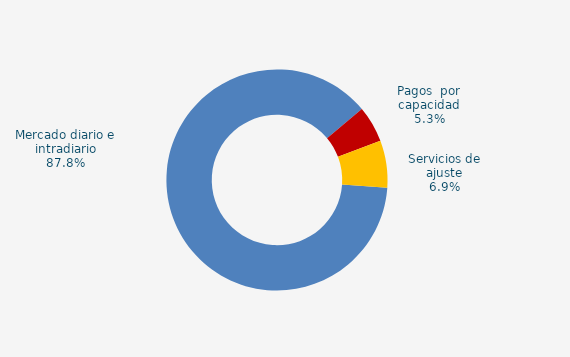
| Category | Series 0 |
|---|---|
| Mercado diario e intradiario | 37.45 |
| Pagos  por capacidad | 2.26 |
| Servicio interrumpibilidad | 0 |
| Servicios de ajuste | 2.94 |